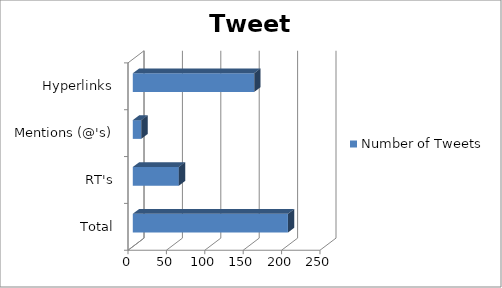
| Category | Number of Tweets |
|---|---|
| Total | 202 |
| RT's | 60 |
| Mentions (@'s) | 11 |
| Hyperlinks | 158 |